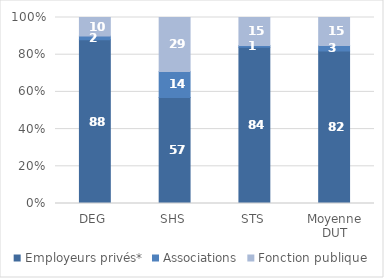
| Category | Employeurs privés* | Associations | Fonction publique |
|---|---|---|---|
| DEG | 88 | 2 | 10 |
| SHS | 57 | 14 | 29 |
| STS | 84 | 1 | 15 |
| Moyenne DUT | 82 | 3 | 15 |